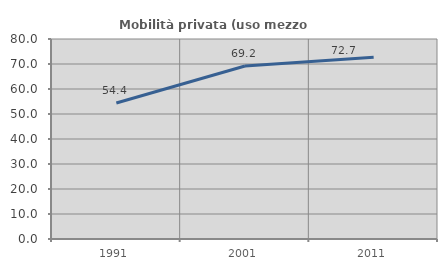
| Category | Mobilità privata (uso mezzo privato) |
|---|---|
| 1991.0 | 54.385 |
| 2001.0 | 69.196 |
| 2011.0 | 72.663 |